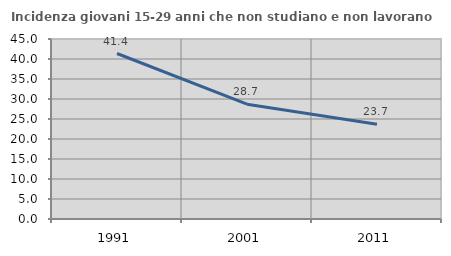
| Category | Incidenza giovani 15-29 anni che non studiano e non lavorano  |
|---|---|
| 1991.0 | 41.372 |
| 2001.0 | 28.701 |
| 2011.0 | 23.661 |